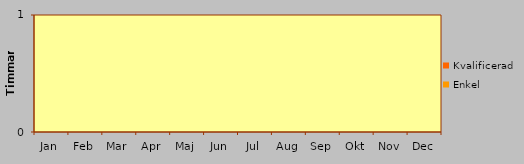
| Category | Enkel | Kvalificerad |
|---|---|---|
| Jan | 0 | 0 |
| Feb | 0 | 0 |
| Mar | 0 | 0 |
| Apr | 0 | 0 |
| Maj | 0 | 0 |
| Jun | 0 | 0 |
| Jul | 0 | 0 |
| Aug | 0 | 0 |
| Sep | 0 | 0 |
| Okt | 0 | 0 |
| Nov | 0 | 0 |
| Dec | 0 | 0 |